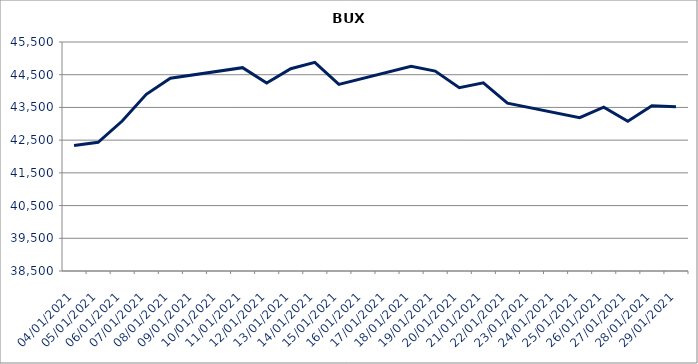
| Category | Series 0 |
|---|---|
| 04/01/2021 | 42333.48 |
| 05/01/2021 | 42434.3 |
| 06/01/2021 | 43085.06 |
| 07/01/2021 | 43900.7 |
| 08/01/2021 | 44393.21 |
| 11/01/2021 | 44715.79 |
| 12/01/2021 | 44246.56 |
| 13/01/2021 | 44684.36 |
| 14/01/2021 | 44876.42 |
| 15/01/2021 | 44204.45 |
| 18/01/2021 | 44755.59 |
| 19/01/2021 | 44610 |
| 20/01/2021 | 44103.4 |
| 21/01/2021 | 44250.43 |
| 22/01/2021 | 43630.22 |
| 25/01/2021 | 43188.94 |
| 26/01/2021 | 43507.13 |
| 27/01/2021 | 43077.24 |
| 28/01/2021 | 43552.04 |
| 29/01/2021 | 43517.12 |